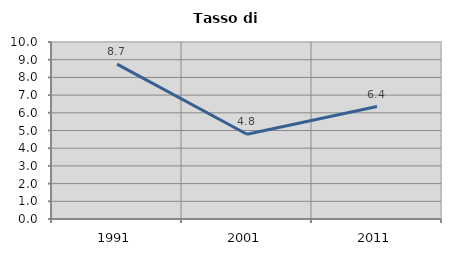
| Category | Tasso di disoccupazione   |
|---|---|
| 1991.0 | 8.747 |
| 2001.0 | 4.791 |
| 2011.0 | 6.353 |